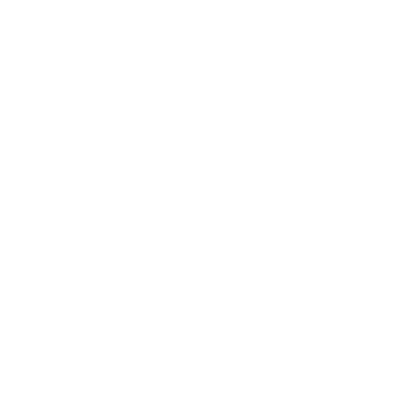
| Category | Series 0 | Series 1 |
|---|---|---|
| Jedzenie | 0 |  |
| Mieszkanie / dom | 0 |  |
| Transport | 0 |  |
| Telekomunikacja | 0 |  |
| Opieka zdrowotna | 0 |  |
| Ubranie | 0 |  |
| Higiena | 0 |  |
| Dzieci | 0 |  |
| Rozrywka | 0 |  |
| Inne wydatki | 0 |  |
| Spłata długów | 0 |  |
| Budowanie oszczędności | 0 |  |
| INNE 1 | 0 |  |
| INNE 2 | 0 |  |
| INNE 3 | 0 |  |